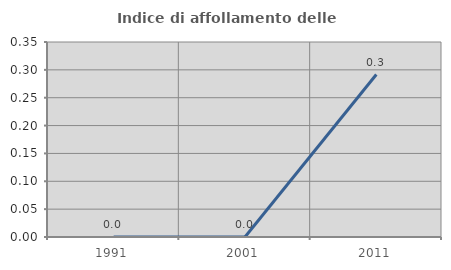
| Category | Indice di affollamento delle abitazioni  |
|---|---|
| 1991.0 | 0 |
| 2001.0 | 0 |
| 2011.0 | 0.292 |